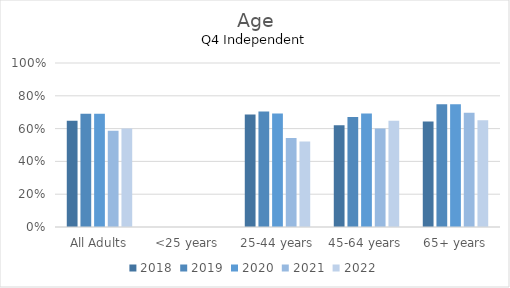
| Category | 2018 | 2019 | 2020 | 2021 | 2022 |
|---|---|---|---|---|---|
| All Adults | 0.648 | 0.691 | 0.691 | 0.587 | 0.601 |
| <25 years | 0 | 0 | 0 | 0 | 0 |
| 25-44 years | 0.686 | 0.704 | 0.692 | 0.542 | 0.522 |
| 45-64 years | 0.621 | 0.67 | 0.692 | 0.601 | 0.648 |
| 65+ years | 0.643 | 0.748 | 0.749 | 0.697 | 0.651 |